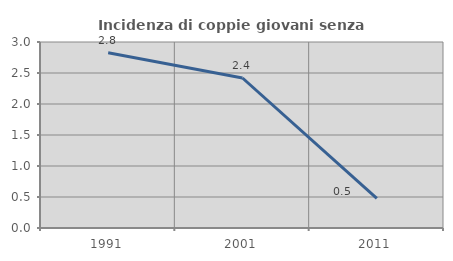
| Category | Incidenza di coppie giovani senza figli |
|---|---|
| 1991.0 | 2.827 |
| 2001.0 | 2.419 |
| 2011.0 | 0.478 |